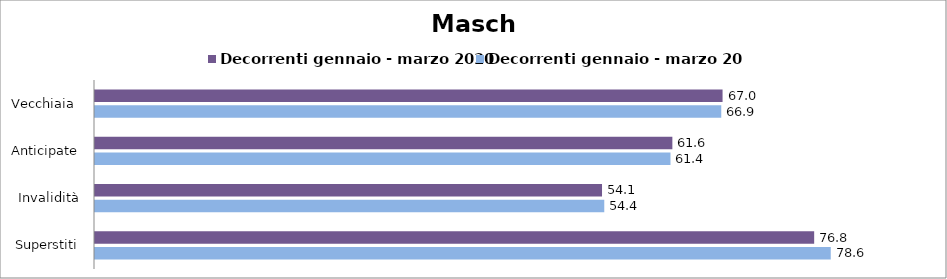
| Category | Decorrenti gennaio - marzo 2020 | Decorrenti gennaio - marzo 2021 |
|---|---|---|
| Vecchiaia  | 67 | 66.86 |
| Anticipate | 61.64 | 61.44 |
| Invalidità | 54.13 | 54.37 |
| Superstiti | 76.78 | 78.55 |